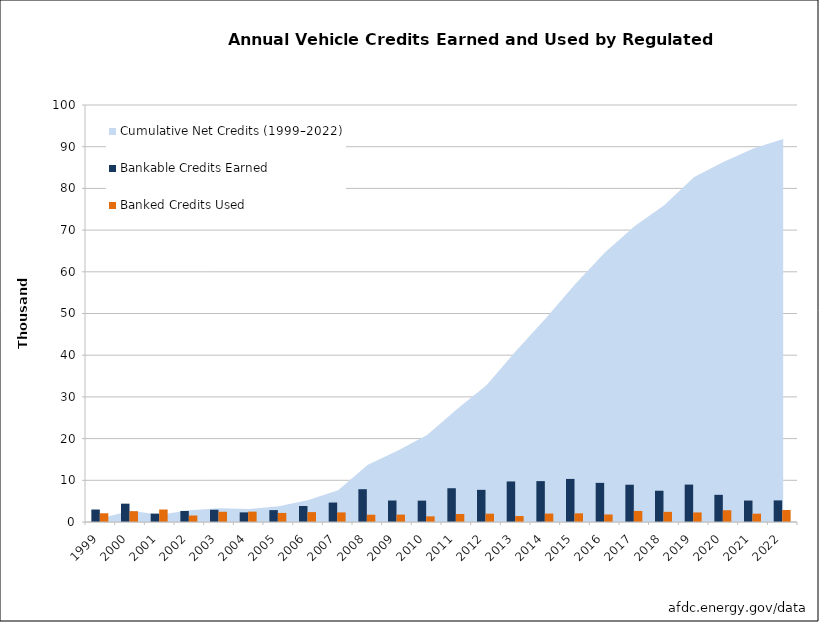
| Category | Bankable Credits Earned | Banked Credits Used |
|---|---|---|
| 1999.0 | 2994 | 2095 |
| 2000.0 | 4398 | 2595 |
| 2001.0 | 2010 | 2998 |
| 2002.0 | 2652 | 1551 |
| 2003.0 | 2938 | 2459 |
| 2004.0 | 2307 | 2486 |
| 2005.0 | 2850 | 2172 |
| 2006.0 | 3840 | 2376 |
| 2007.0 | 4665 | 2304 |
| 2008.0 | 7862 | 1748 |
| 2009.0 | 5156 | 1776 |
| 2010.0 | 5126 | 1360 |
| 2011.0 | 8097 | 1918 |
| 2012.0 | 7714 | 1996 |
| 2013.0 | 9727 | 1427 |
| 2014.0 | 9805 | 2022 |
| 2015.0 | 10330 | 2078 |
| 2016.0 | 9386 | 1804 |
| 2017.0 | 8937 | 2655 |
| 2018.0 | 7498 | 2435 |
| 2019.0 | 8973 | 2296 |
| 2020.0 | 6517 | 2824 |
| 2021.0 | 5145 | 1997 |
| 2022.0 | 5182 | 2872 |